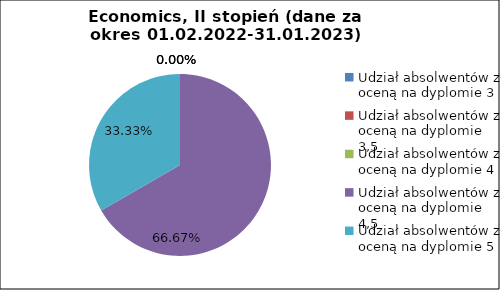
| Category | Series 0 |
|---|---|
| Udział absolwentów z oceną na dyplomie 3 | 0 |
| Udział absolwentów z oceną na dyplomie 3,5 | 0 |
| Udział absolwentów z oceną na dyplomie 4 | 0 |
| Udział absolwentów z oceną na dyplomie 4,5 | 66.667 |
| Udział absolwentów z oceną na dyplomie 5 | 33.333 |